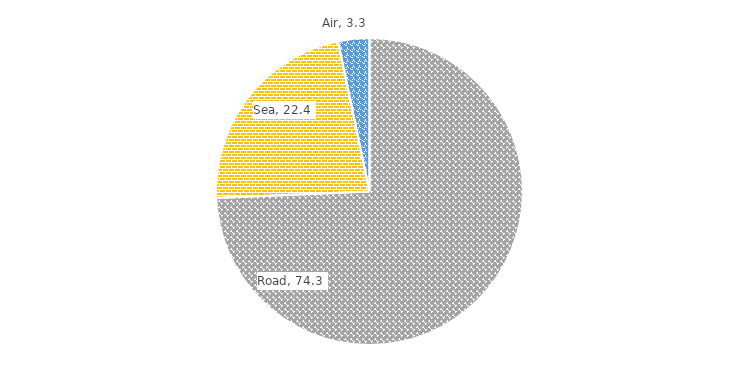
| Category | % share |
|---|---|
| Road | 74.274 |
| Sea | 22.377 |
| Air | 3.285 |